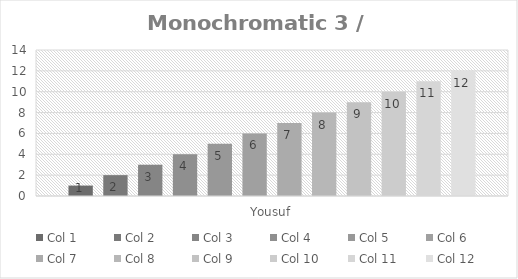
| Category | Col 1 | Col 2 | Col 3 | Col 4 | Col 5 | Col 6 | Col 7 | Col 8 | Col 9 | Col 10 | Col 11 | Col 12 |
|---|---|---|---|---|---|---|---|---|---|---|---|---|
| Yousuf | 1 | 2 | 3 | 4 | 5 | 6 | 7 | 8 | 9 | 10 | 11 | 12 |